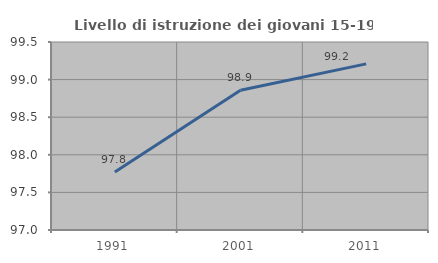
| Category | Livello di istruzione dei giovani 15-19 anni |
|---|---|
| 1991.0 | 97.772 |
| 2001.0 | 98.859 |
| 2011.0 | 99.209 |